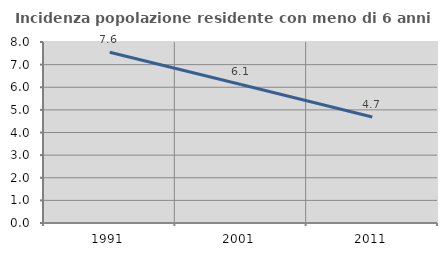
| Category | Incidenza popolazione residente con meno di 6 anni |
|---|---|
| 1991.0 | 7.55 |
| 2001.0 | 6.123 |
| 2011.0 | 4.686 |